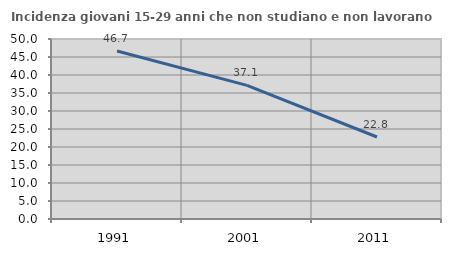
| Category | Incidenza giovani 15-29 anni che non studiano e non lavorano  |
|---|---|
| 1991.0 | 46.667 |
| 2001.0 | 37.113 |
| 2011.0 | 22.783 |